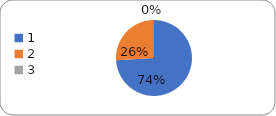
| Category | Series 0 |
|---|---|
| 0 | 77 |
| 1 | 27 |
| 2 | 0 |